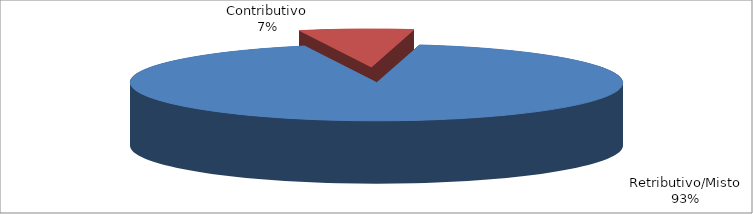
| Category | Decorrenti ANNO 2020 |
|---|---|
| Retributivo/Misto | 328214 |
| Contributivo | 26602 |